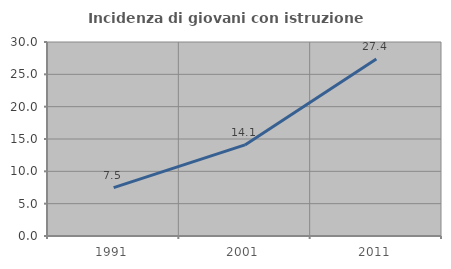
| Category | Incidenza di giovani con istruzione universitaria |
|---|---|
| 1991.0 | 7.487 |
| 2001.0 | 14.08 |
| 2011.0 | 27.376 |